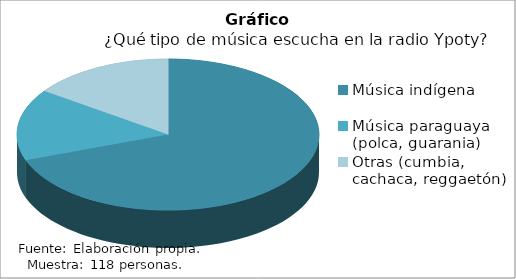
| Category | Series 0 |
|---|---|
| Música indígena | 82 |
| Música paraguaya (polca, guarania) | 18 |
| Otras (cumbia, cachaca, reggaetón) | 18 |